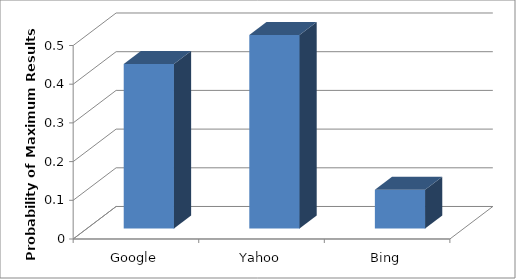
| Category | Series 0 |
|---|---|
| Google | 0.425 |
| Yahoo | 0.5 |
| Bing | 0.1 |